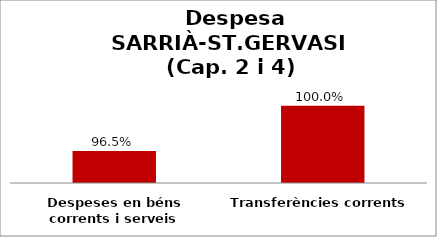
| Category | Series 0 |
|---|---|
| Despeses en béns corrents i serveis | 0.965 |
| Transferències corrents | 1 |